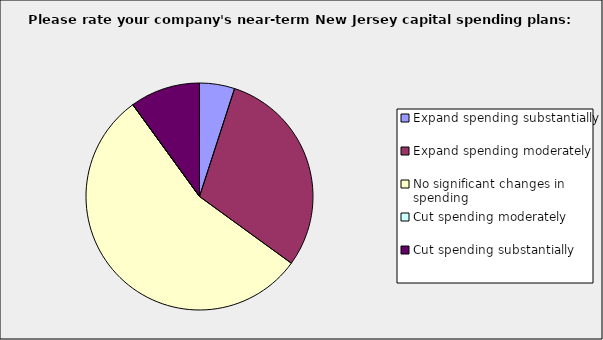
| Category | Series 0 |
|---|---|
| Expand spending substantially | 0.05 |
| Expand spending moderately | 0.3 |
| No significant changes in spending | 0.55 |
| Cut spending moderately | 0 |
| Cut spending substantially | 0.1 |